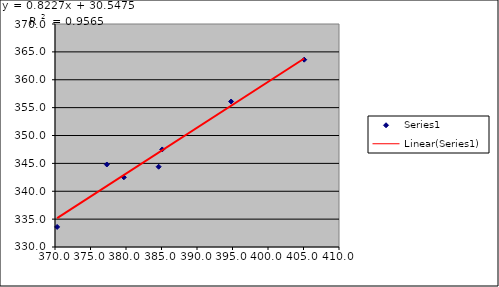
| Category | Series 0 |
|---|---|
| 385.1 | 347.5 |
| 394.8 | 356.1 |
| 379.7 | 342.5 |
| 370.3 | 333.6 |
| 405.1 | 363.6 |
| 377.3 | 344.8 |
| 384.6 | 344.4 |